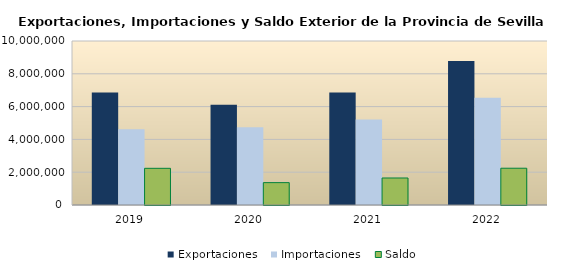
| Category | Exportaciones | Importaciones | Saldo  |
|---|---|---|---|
| 2019.0 | 6857452.1 | 4621080.09 | 2236372.01 |
| 2020.0 | 6112388.92 | 4748243.15 | 1364145.77 |
| 2021.0 | 6867023.834 | 5220320.083 | 1646703.751 |
| 2022.0 | 8786556.783 | 6544666.596 | 2241890.187 |